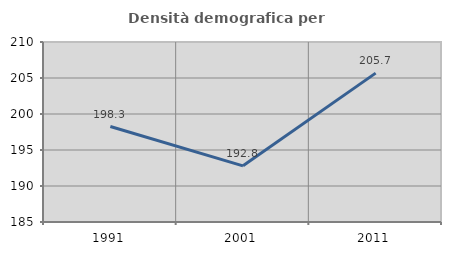
| Category | Densità demografica |
|---|---|
| 1991.0 | 198.263 |
| 2001.0 | 192.801 |
| 2011.0 | 205.678 |